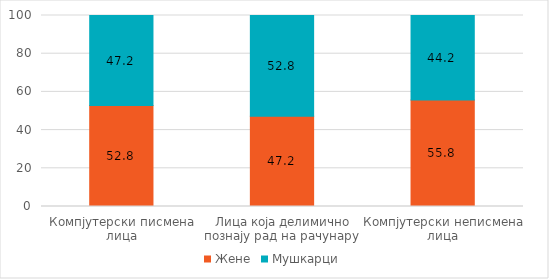
| Category | Женe | Мушкaрци |
|---|---|---|
| Компјутерски писмена лица | 52.817 | 47.183 |
| Лица која делимично познају рад на рачунару | 47.208 | 52.792 |
| Компјутерски неписмена лица | 55.816 | 44.184 |